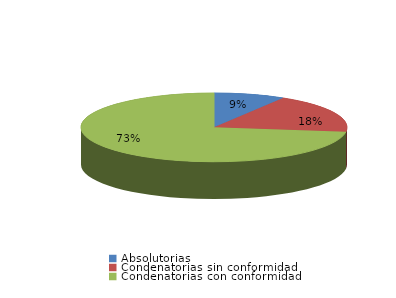
| Category | Series 0 |
|---|---|
| Absolutorias | 85 |
| Condenatorias sin conformidad | 180 |
| Condenatorias con conformidad | 715 |